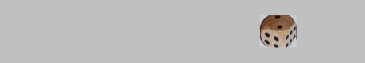
| Category | 1 | 2 | 3 | 4 | 5 | 6 |
|---|---|---|---|---|---|---|
|  | 0 | 0 | 0 | 0 | 0 | 0 |
|  | 0 | 0 | 0 | 0 | 0 | 0 |
|  | 0 | 0 | 0 | 0 | 0 | 0 |
|  | 0 | 0 | 0 | 0 | 0 | 0 |
| 0 | 0 | 0 | 0 | 0 | 0 | 0 |
| 2 | 0 | 1 | 0 | 0 | 0 | 0 |